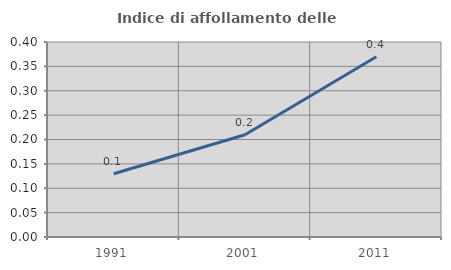
| Category | Indice di affollamento delle abitazioni  |
|---|---|
| 1991.0 | 0.13 |
| 2001.0 | 0.21 |
| 2011.0 | 0.37 |